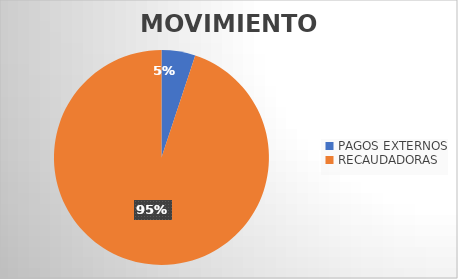
| Category | MOVIMIENTOS |
|---|---|
| PAGOS EXTERNOS | 1137 |
| RECAUDADORAS | 21233 |